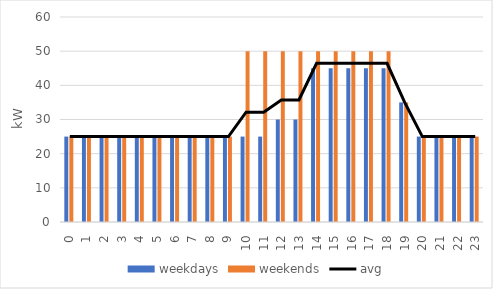
| Category | weekdays | weekends |
|---|---|---|
| 0.0 | 25 | 25 |
| 1.0 | 25 | 25 |
| 2.0 | 25 | 25 |
| 3.0 | 25 | 25 |
| 4.0 | 25 | 25 |
| 5.0 | 25 | 25 |
| 6.0 | 25 | 25 |
| 7.0 | 25 | 25 |
| 8.0 | 25 | 25 |
| 9.0 | 25 | 25 |
| 10.0 | 25 | 50 |
| 11.0 | 25 | 50 |
| 12.0 | 30 | 50 |
| 13.0 | 30 | 50 |
| 14.0 | 45 | 50 |
| 15.0 | 45 | 50 |
| 16.0 | 45 | 50 |
| 17.0 | 45 | 50 |
| 18.0 | 45 | 50 |
| 19.0 | 35 | 35 |
| 20.0 | 25 | 25 |
| 21.0 | 25 | 25 |
| 22.0 | 25 | 25 |
| 23.0 | 25 | 25 |